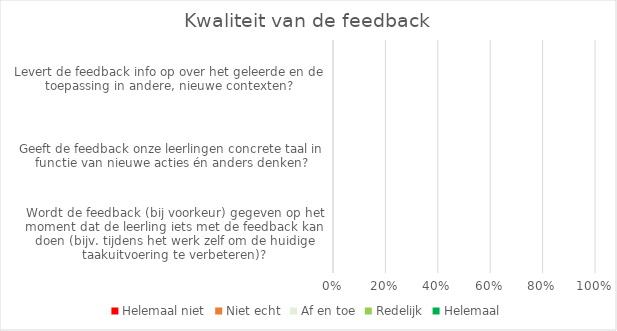
| Category | Helemaal niet | Niet echt | Af en toe | Redelijk | Helemaal |
|---|---|---|---|---|---|
| Wordt de feedback (bij voorkeur) gegeven op het moment dat de leerling iets met de feedback kan doen (bijv. tijdens het werk zelf om de huidige taakuitvoering te verbeteren)? | 0 | 0 | 0 | 0 | 0 |
| Geeft de feedback onze leerlingen concrete taal in functie van nieuwe acties én anders denken? | 0 | 0 | 0 | 0 | 0 |
| Levert de feedback info op over het geleerde en de toepassing in andere, nieuwe contexten? | 0 | 0 | 0 | 0 | 0 |